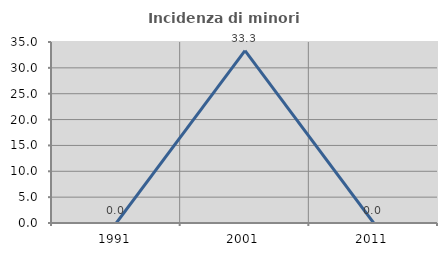
| Category | Incidenza di minori stranieri |
|---|---|
| 1991.0 | 0 |
| 2001.0 | 33.333 |
| 2011.0 | 0 |